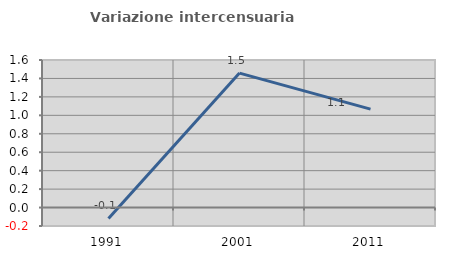
| Category | Variazione intercensuaria annua |
|---|---|
| 1991.0 | -0.119 |
| 2001.0 | 1.458 |
| 2011.0 | 1.067 |